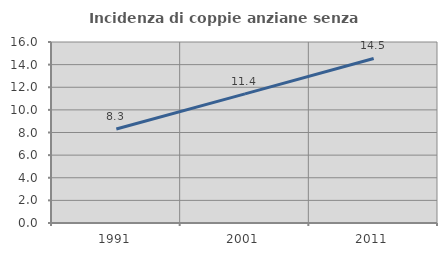
| Category | Incidenza di coppie anziane senza figli  |
|---|---|
| 1991.0 | 8.309 |
| 2001.0 | 11.416 |
| 2011.0 | 14.545 |